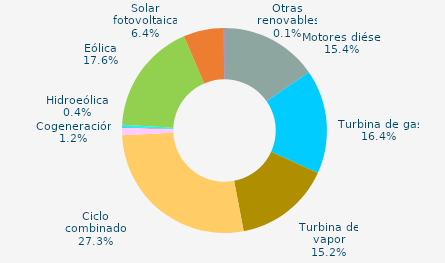
| Category | Series 0 |
|---|---|
| Motores diésel | 15.371 |
| Turbina de gas | 16.415 |
| Turbina de vapor | 15.213 |
| Ciclo combinado | 27.278 |
| Cogeneración | 1.204 |
| Hidráulica | 0.048 |
| Hidroeólica | 0.357 |
| Eólica | 17.643 |
| Solar fotovoltaica | 6.354 |
| Otras renovables | 0.117 |